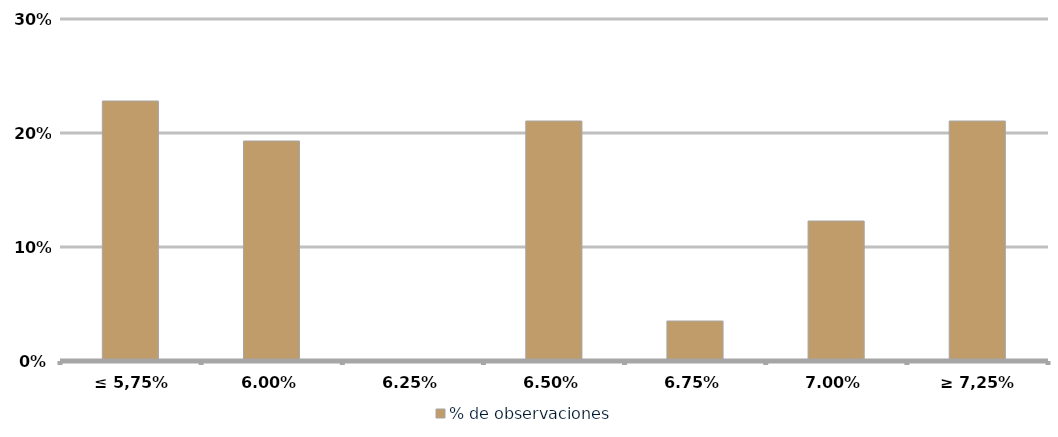
| Category | % de observaciones  |
|---|---|
| ≤ 5,75% | 0.228 |
| 6,00% | 0.193 |
| 6,25% | 0 |
| 6,50% | 0.211 |
| 6,75% | 0.035 |
| 7,00% | 0.123 |
| ≥ 7,25% | 0.211 |